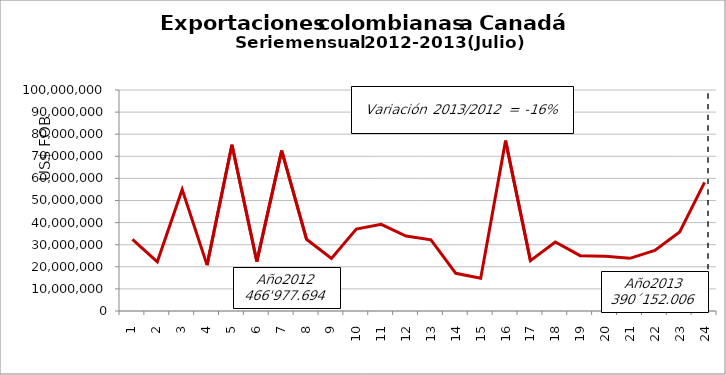
| Category | Series 0 |
|---|---|
| 0 | 32401780.14 |
| 1 | 22256274.18 |
| 2 | 54945928.48 |
| 3 | 20756543.5 |
| 4 | 75242696.66 |
| 5 | 22375699.18 |
| 6 | 72561612.92 |
| 7 | 32449219.75 |
| 8 | 23820922.76 |
| 9 | 37036748.17 |
| 10 | 39192850.34 |
| 11 | 33937418.1 |
| 12 | 32204023.66 |
| 13 | 17045162.03 |
| 14 | 14785216.41 |
| 15 | 77090421.74 |
| 16 | 22766605.35 |
| 17 | 31234296.93 |
| 18 | 25045990.48 |
| 19 | 24771037 |
| 20 | 23839581.83 |
| 21 | 27430766.81 |
| 22 | 35748521.36 |
| 23 | 58190382.29 |